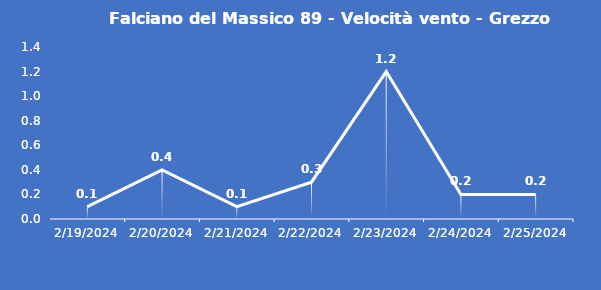
| Category | Falciano del Massico 89 - Velocità vento - Grezzo (m/s) |
|---|---|
| 2/19/24 | 0.1 |
| 2/20/24 | 0.4 |
| 2/21/24 | 0.1 |
| 2/22/24 | 0.3 |
| 2/23/24 | 1.2 |
| 2/24/24 | 0.2 |
| 2/25/24 | 0.2 |